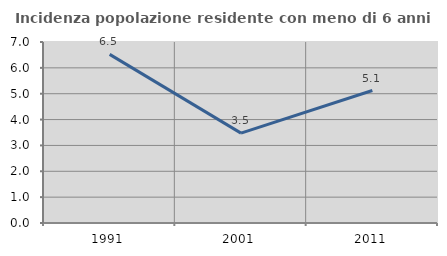
| Category | Incidenza popolazione residente con meno di 6 anni |
|---|---|
| 1991.0 | 6.522 |
| 2001.0 | 3.475 |
| 2011.0 | 5.123 |